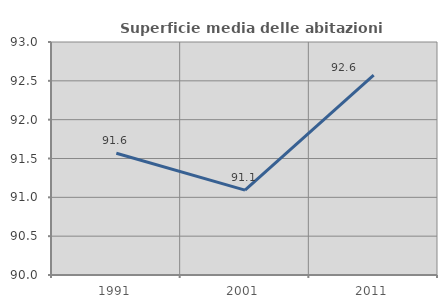
| Category | Superficie media delle abitazioni occupate |
|---|---|
| 1991.0 | 91.568 |
| 2001.0 | 91.093 |
| 2011.0 | 92.573 |